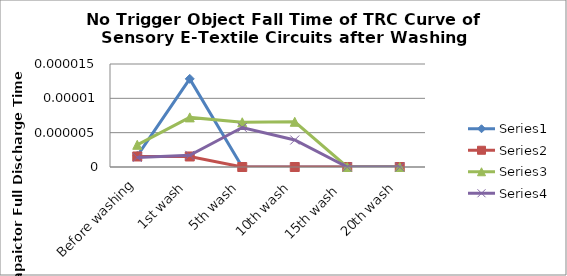
| Category | Series 0 | Series 1 | Series 2 | Series 3 |
|---|---|---|---|---|
| Before washing | 0 | 0 | 0 | 0 |
| 1st wash | 0 | 0 | 0 | 0 |
| 5th wash | 0 | 0 | 0 | 0 |
| 10th wash | 0 | 0 | 0 | 0 |
| 15th wash  | 0 | 0 | 0 | 0 |
| 20th wash | 0 | 0 | 0 | 0 |